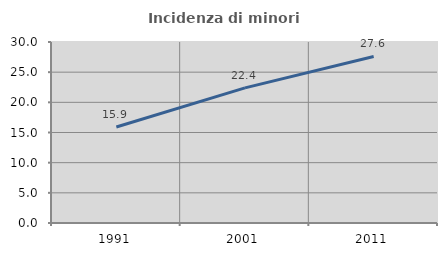
| Category | Incidenza di minori stranieri |
|---|---|
| 1991.0 | 15.909 |
| 2001.0 | 22.4 |
| 2011.0 | 27.602 |